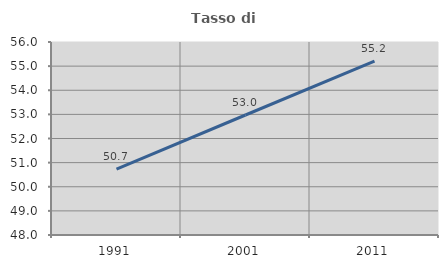
| Category | Tasso di occupazione   |
|---|---|
| 1991.0 | 50.729 |
| 2001.0 | 52.974 |
| 2011.0 | 55.21 |